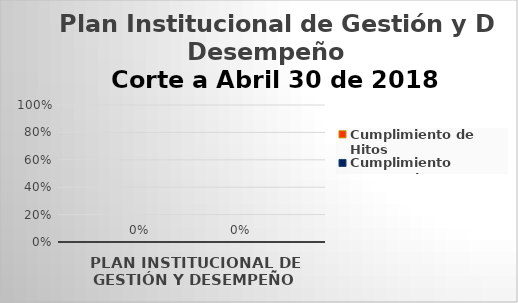
| Category | Cumplimiento de Hitos | Cumplimiento Temporal |
|---|---|---|
| PLAN INSTITUCIONAL DE GESTIÓN Y DESEMPEÑO | 0 | 0 |